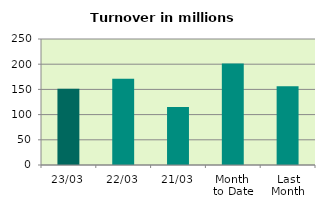
| Category | Series 0 |
|---|---|
| 23/03 | 151.051 |
| 22/03 | 171.068 |
| 21/03 | 115.21 |
| Month 
to Date | 201.374 |
| Last
Month | 156.222 |